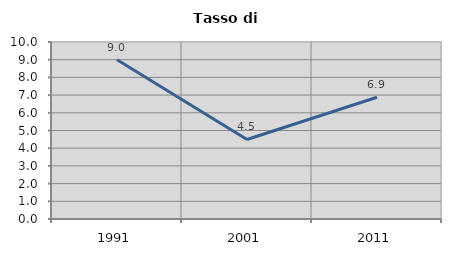
| Category | Tasso di disoccupazione   |
|---|---|
| 1991.0 | 9 |
| 2001.0 | 4.494 |
| 2011.0 | 6.881 |